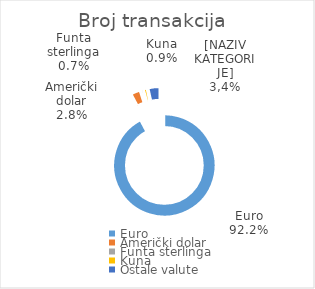
| Category | Broj transakcija  |
|---|---|
| Euro | 3762507 |
| Američki dolar | 112425 |
| Funta sterlinga | 27513 |
| Kuna | 36677 |
| Ostale valute | 141454 |